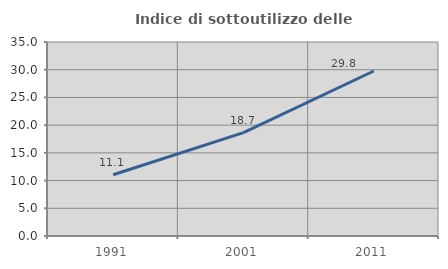
| Category | Indice di sottoutilizzo delle abitazioni  |
|---|---|
| 1991.0 | 11.05 |
| 2001.0 | 18.652 |
| 2011.0 | 29.77 |